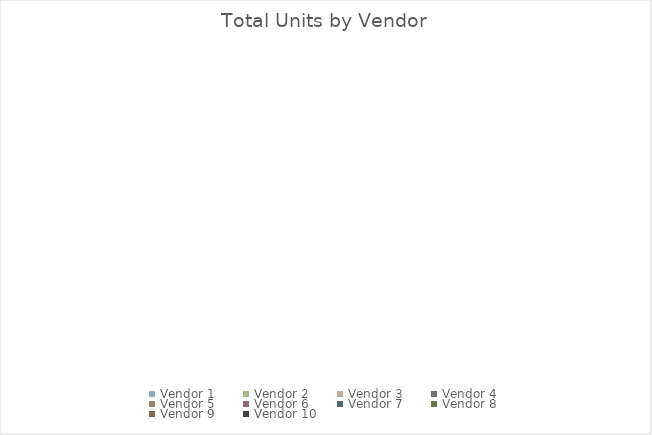
| Category | Series 0 |
|---|---|
| Vendor 1 | 0 |
| Vendor 2 | 0 |
| Vendor 3 | 0 |
| Vendor 4 | 0 |
| Vendor 5 | 0 |
| Vendor 6 | 0 |
| Vendor 7 | 0 |
| Vendor 8 | 0 |
| Vendor 9 | 0 |
| Vendor 10 | 0 |